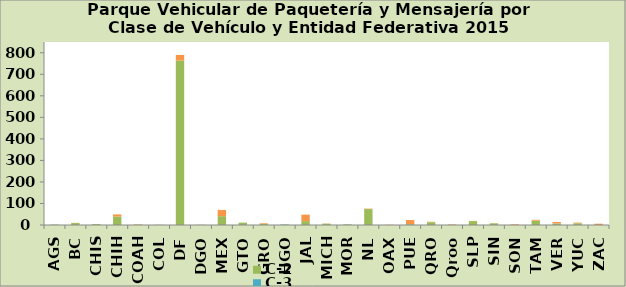
| Category | C-2 | C-3 | Camioneta |
|---|---|---|---|
| AGS | 2 | 0 | 0 |
| BC | 9 | 0 | 1 |
| CHIS | 4 | 0 | 0 |
| CHIH | 39 | 0 | 10 |
| COAH | 2 | 0 | 1 |
| COL | 1 | 0 | 0 |
| DF | 764 | 0 | 26 |
| DGO | 1 | 0 | 0 |
| MEX | 41 | 0 | 29 |
| GTO | 11 | 0 | 0 |
| GRO | 5 | 0 | 3 |
| HGO | 2 | 1 | 0 |
| JAL | 18 | 0 | 30 |
| MICH | 6 | 0 | 1 |
| MOR | 3 | 0 | 0 |
| NL | 74 | 0 | 2 |
| OAX | 0 | 0 | 1 |
| PUE | 4 | 0 | 19 |
| QRO | 13 | 0 | 2 |
| Qroo | 1 | 0 | 2 |
| SLP | 18 | 0 | 1 |
| SIN | 8 | 0 | 0 |
| SON | 0 | 0 | 3 |
| TAM | 20 | 0 | 4 |
| VER | 6 | 1 | 7 |
| YUC | 8 | 0 | 3 |
| ZAC | 0 | 0 | 6 |